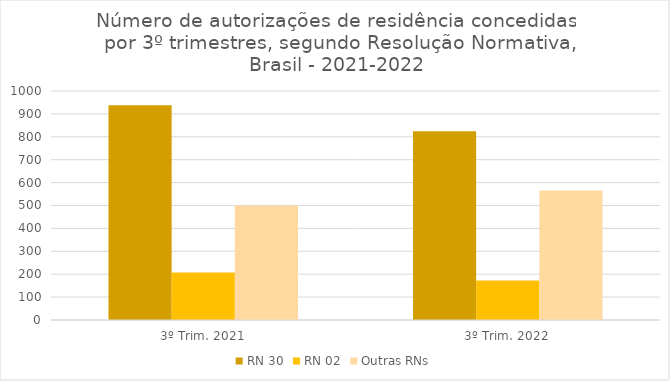
| Category | RN 30 | RN 02 | Outras RNs |
|---|---|---|---|
| 3º Trim. 2021 | 938 | 207 | 500 |
| 3º Trim. 2022 | 824 | 173 | 565 |